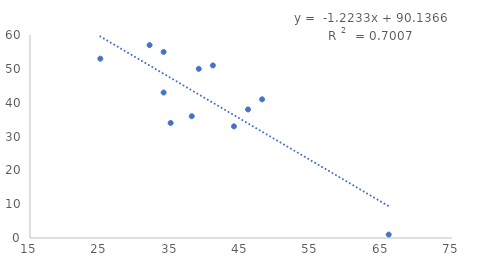
| Category | Series 0 |
|---|---|
| 34.0 | 43 |
| 34.0 | 55 |
| 35.0 | 34 |
| 25.0 | 53 |
| 44.0 | 33 |
| 38.0 | 36 |
| 41.0 | 51 |
| 46.0 | 38 |
| 48.0 | 41 |
| 39.0 | 50 |
| 32.0 | 57 |
| 66.0 | 1 |